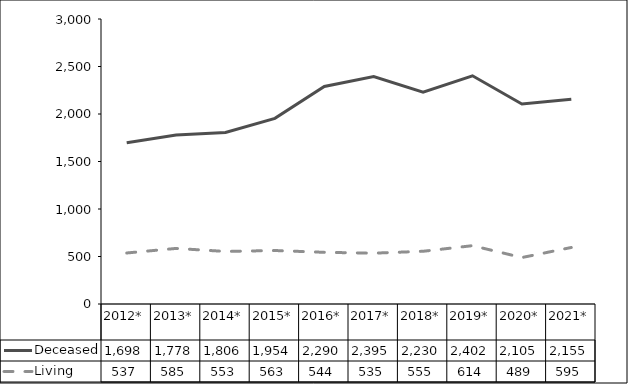
| Category | Deceased | Living |
|---|---|---|
| 2012* | 1698 | 537 |
| 2013* | 1778 | 585 |
| 2014* | 1806 | 553 |
| 2015* | 1954 | 563 |
| 2016* | 2290 | 544 |
| 2017* | 2395 | 535 |
| 2018* | 2230 | 555 |
| 2019* | 2402 | 614 |
| 2020* | 2105 | 489 |
| 2021* | 2155 | 595 |